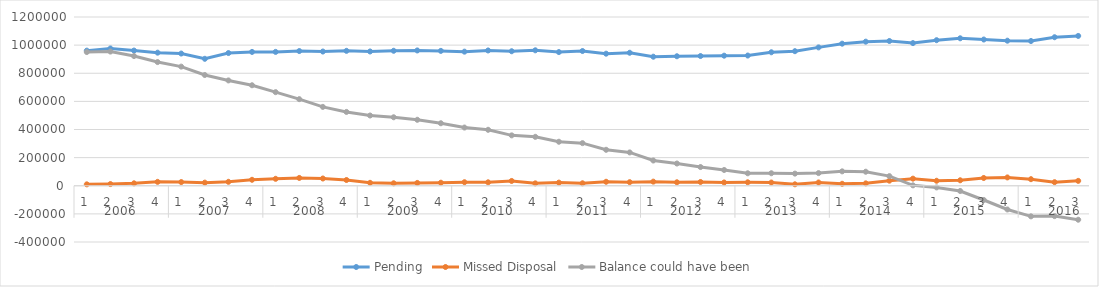
| Category | Pending | Missed Disposal | Balance could have been |
|---|---|---|---|
| 0 | 960804 | 10016.593 | 950787.407 |
| 1 | 976178 | 11928.645 | 954232.762 |
| 2 | 961383 | 17225.565 | 922212.197 |
| 3 | 946395 | 27770.958 | 879453.239 |
| 4 | 940161 | 26094.986 | 847124.253 |
| 5 | 902757 | 22178.824 | 787541.429 |
| 6 | 943686 | 28068.533 | 749019.897 |
| 7 | 951654 | 42395.137 | 714592.76 |
| 8 | 951916 | 49340.239 | 665514.521 |
| 9 | 957822 | 55666.138 | 615754.383 |
| 10 | 954401 | 51552.238 | 560781.144 |
| 11 | 959434 | 40873.016 | 524941.128 |
| 12 | 954825 | 20799.986 | 499532.143 |
| 13 | 959820 | 17583.103 | 486944.039 |
| 14 | 962124 | 20111.621 | 469136.419 |
| 15 | 959010 | 21627.132 | 444395.287 |
| 16 | 953597 | 25064.491 | 413917.796 |
| 17 | 962055 | 24440.251 | 397935.546 |
| 18 | 956448 | 34076.46 | 358252.086 |
| 19 | 963190 | 17072.494 | 347921.592 |
| 20 | 950617 | 22417.804 | 312930.787 |
| 21 | 958052 | 17445.772 | 302920.015 |
| 22 | 939142 | 28325.212 | 255684.803 |
| 23 | 945737 | 25360.232 | 236919.571 |
| 24 | 917620 | 29259.464 | 179543.107 |
| 25 | 920790 | 24644.163 | 158068.944 |
| 26 | 922507 | 26738.068 | 133047.876 |
| 27 | 924943 | 23382.14 | 112101.737 |
| 28 | 925926 | 24522.51 | 88562.227 |
| 29 | 949242 | 22900.929 | 88977.298 |
| 30 | 956864 | 10278.205 | 86321.093 |
| 31 | 983882 | 23379.502 | 89959.59 |
| 32 | 1010269 | 13938.956 | 102407.634 |
| 33 | 1024650 | 17048.416 | 99740.218 |
| 34 | 1029355 | 36084.348 | 68360.87 |
| 35 | 1014372 | 50439.923 | 2937.948 |
| 36 | 1035068 | 35472.479 | -11838.531 |
| 37 | 1048611 | 38914.249 | -37209.78 |
| 38 | 1039869 | 55214.111 | -101165.891 |
| 39 | 1031515 | 59162.198 | -168682.089 |
| 40 | 1029237 | 46678.16 | -217638.249 |
| 41 | 1056171 | 25291.919 | -215996.169 |
| 42 | 1065381 | 34749.447 | -241535.616 |